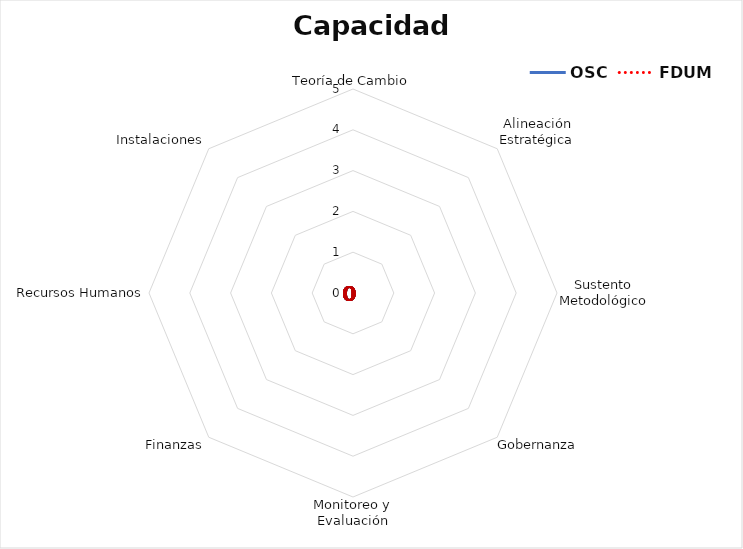
| Category | OSC | FDUM |
|---|---|---|
| Teoría de Cambio | 0 | 0 |
| Alineación Estratégica | 0 | 0 |
| Sustento Metodológico | 0 | 0 |
| Gobernanza | 0 | 0 |
| Monitoreo y Evaluación | 0 | 0 |
| Finanzas | 0 | 0 |
| Recursos Humanos | 0 | 0 |
| Instalaciones | 0 | 0 |